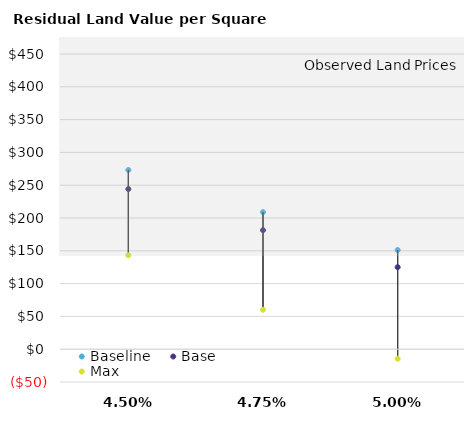
| Category | Baseline | Base | Max |
|---|---|---|---|
| 0.045 | 273.173 | 244.155 | 143.167 |
| 0.0475 | 208.962 | 181.471 | 60.171 |
| 0.05 | 151.172 | 125.055 | -14.525 |